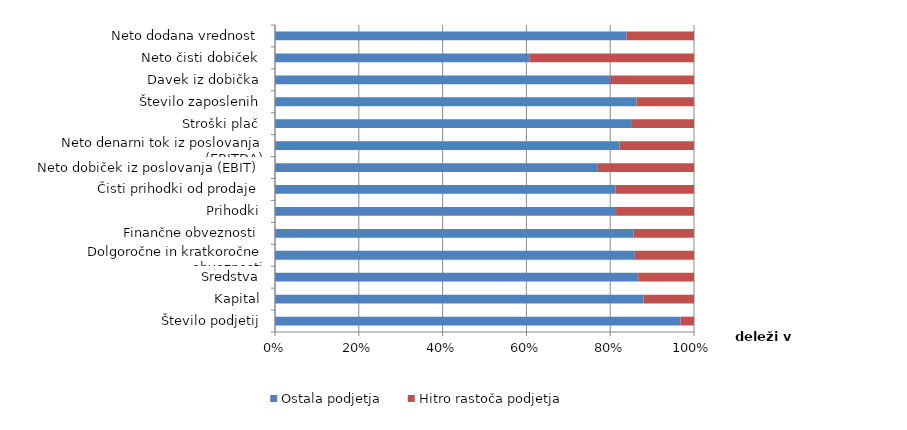
| Category | Ostala podjetja | Hitro rastoča podjetja |
|---|---|---|
| Število podjetij | 131494 | 4380 |
| Kapital | 39668134 | 5421627.555 |
| Sredstva | 102568216 | 15726079.878 |
| Dolgoročne in kratkoročne obveznosti | 62699237 | 10301272.405 |
| Finančne obveznosti | 39528962 | 6651611.26 |
| Prihodki | 82696661 | 18903158.349 |
| Čisti prihodki od prodaje | 79509017 | 18286424.198 |
| Neto dobiček iz poslovanja (EBIT) | 2644577 | 794594.474 |
| Neto denarni tok iz poslovanja (EBITDA) | 6987720 | 1509365.15 |
| Stroški plač | 8111160 | 1432466.75 |
| Število zaposlenih | 496182 | 78734.7 |
| Davek iz dobička | 516261 | 129099 |
| Neto čisti dobiček | 913938 | 591831 |
| Neto dodana vrednost | 18076332 | 3460592 |